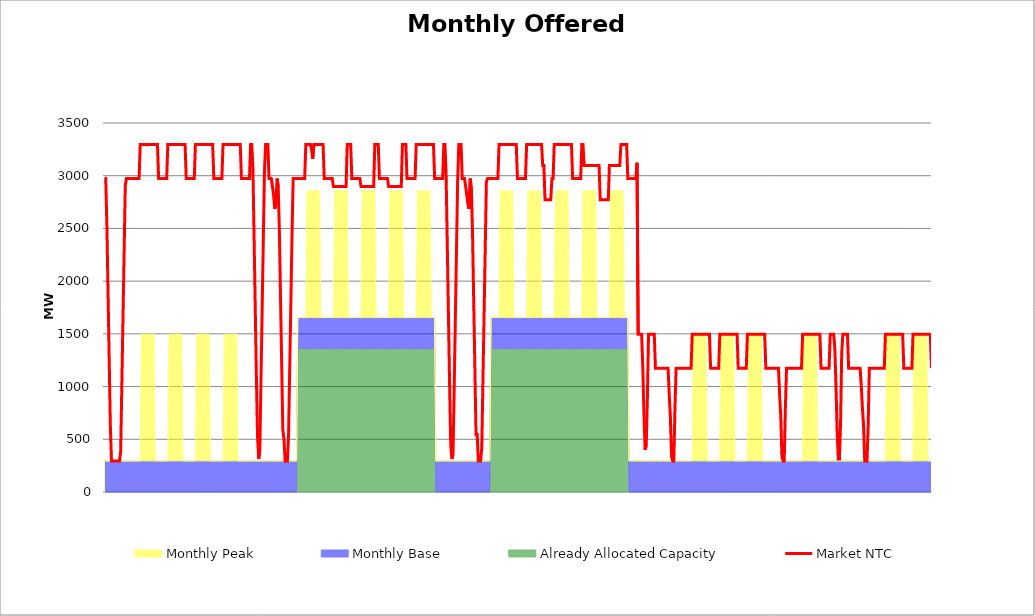
| Category | Market NTC |
|---|---|
| 0 | 2973 |
| 1 | 2973 |
| 2 | 2527 |
| 3 | 1897 |
| 4 | 1268 |
| 5 | 639 |
| 6 | 295 |
| 7 | 295 |
| 8 | 295 |
| 9 | 295 |
| 10 | 295 |
| 11 | 295 |
| 12 | 295 |
| 13 | 295 |
| 14 | 387 |
| 15 | 1016 |
| 16 | 1645 |
| 17 | 2275 |
| 18 | 2904 |
| 19 | 2973 |
| 20 | 2973 |
| 21 | 2973 |
| 22 | 2973 |
| 23 | 2973 |
| 24 | 2973 |
| 25 | 2973 |
| 26 | 2973 |
| 27 | 2973 |
| 28 | 2973 |
| 29 | 2973 |
| 30 | 2973 |
| 31 | 3297 |
| 32 | 3297 |
| 33 | 3297 |
| 34 | 3297 |
| 35 | 3297 |
| 36 | 3297 |
| 37 | 3292 |
| 38 | 3297 |
| 39 | 3297 |
| 40 | 3297 |
| 41 | 3297 |
| 42 | 3297 |
| 43 | 3297 |
| 44 | 3297 |
| 45 | 3297 |
| 46 | 3297 |
| 47 | 2973 |
| 48 | 2973 |
| 49 | 2973 |
| 50 | 2973 |
| 51 | 2973 |
| 52 | 2973 |
| 53 | 2973 |
| 54 | 2973 |
| 55 | 3297 |
| 56 | 3297 |
| 57 | 3297 |
| 58 | 3297 |
| 59 | 3297 |
| 60 | 3297 |
| 61 | 3297 |
| 62 | 3297 |
| 63 | 3297 |
| 64 | 3297 |
| 65 | 3297 |
| 66 | 3297 |
| 67 | 3297 |
| 68 | 3297 |
| 69 | 3297 |
| 70 | 3297 |
| 71 | 2973 |
| 72 | 2973 |
| 73 | 2973 |
| 74 | 2973 |
| 75 | 2973 |
| 76 | 2973 |
| 77 | 2973 |
| 78 | 2973 |
| 79 | 3297 |
| 80 | 3297 |
| 81 | 3297 |
| 82 | 3297 |
| 83 | 3297 |
| 84 | 3297 |
| 85 | 3297 |
| 86 | 3297 |
| 87 | 3297 |
| 88 | 3297 |
| 89 | 3297 |
| 90 | 3297 |
| 91 | 3297 |
| 92 | 3297 |
| 93 | 3297 |
| 94 | 3297 |
| 95 | 2973 |
| 96 | 2973 |
| 97 | 2973 |
| 98 | 2973 |
| 99 | 2973 |
| 100 | 2973 |
| 101 | 2973 |
| 102 | 2973 |
| 103 | 3297 |
| 104 | 3297 |
| 105 | 3297 |
| 106 | 3297 |
| 107 | 3297 |
| 108 | 3297 |
| 109 | 3297 |
| 110 | 3297 |
| 111 | 3297 |
| 112 | 3297 |
| 113 | 3297 |
| 114 | 3297 |
| 115 | 3297 |
| 116 | 3297 |
| 117 | 3297 |
| 118 | 3297 |
| 119 | 2973 |
| 120 | 2973 |
| 121 | 2973 |
| 122 | 2973 |
| 123 | 2973 |
| 124 | 2973 |
| 125 | 2973 |
| 126 | 2973 |
| 127 | 3297 |
| 128 | 3297 |
| 129 | 3073 |
| 130 | 2416 |
| 131 | 1759 |
| 132 | 1102 |
| 133 | 532 |
| 134 | 313 |
| 135 | 401 |
| 136 | 1058 |
| 137 | 1715 |
| 138 | 2372 |
| 139 | 3030 |
| 140 | 3297 |
| 141 | 3297 |
| 142 | 3297 |
| 143 | 2973 |
| 144 | 2973 |
| 145 | 2973 |
| 146 | 2896 |
| 147 | 2812 |
| 148 | 2686 |
| 149 | 2728 |
| 150 | 2973 |
| 151 | 2896 |
| 152 | 2476 |
| 153 | 1847 |
| 154 | 1218 |
| 155 | 588 |
| 156 | 504 |
| 157 | 295 |
| 158 | 295 |
| 159 | 295 |
| 160 | 546 |
| 161 | 1176 |
| 162 | 1805 |
| 163 | 2434 |
| 164 | 2973 |
| 165 | 2973 |
| 166 | 2973 |
| 167 | 2973 |
| 168 | 2973 |
| 169 | 2973 |
| 170 | 2973 |
| 171 | 2973 |
| 172 | 2973 |
| 173 | 2973 |
| 174 | 2973 |
| 175 | 3297 |
| 176 | 3297 |
| 177 | 3297 |
| 178 | 3297 |
| 179 | 3297 |
| 180 | 3249 |
| 181 | 3161 |
| 182 | 3297 |
| 183 | 3297 |
| 184 | 3297 |
| 185 | 3297 |
| 186 | 3297 |
| 187 | 3297 |
| 188 | 3297 |
| 189 | 3297 |
| 190 | 3297 |
| 191 | 2973 |
| 192 | 2973 |
| 193 | 2973 |
| 194 | 2973 |
| 195 | 2973 |
| 196 | 2973 |
| 197 | 2973 |
| 198 | 2973 |
| 199 | 2897 |
| 200 | 2897 |
| 201 | 2897 |
| 202 | 2897 |
| 203 | 2897 |
| 204 | 2897 |
| 205 | 2897 |
| 206 | 2897 |
| 207 | 2897 |
| 208 | 2897 |
| 209 | 2897 |
| 210 | 2897 |
| 211 | 3297 |
| 212 | 3297 |
| 213 | 3297 |
| 214 | 3297 |
| 215 | 2973 |
| 216 | 2973 |
| 217 | 2973 |
| 218 | 2973 |
| 219 | 2973 |
| 220 | 2973 |
| 221 | 2973 |
| 222 | 2973 |
| 223 | 2897 |
| 224 | 2897 |
| 225 | 2897 |
| 226 | 2897 |
| 227 | 2897 |
| 228 | 2897 |
| 229 | 2897 |
| 230 | 2897 |
| 231 | 2897 |
| 232 | 2897 |
| 233 | 2897 |
| 234 | 2897 |
| 235 | 3297 |
| 236 | 3297 |
| 237 | 3297 |
| 238 | 3297 |
| 239 | 2973 |
| 240 | 2973 |
| 241 | 2973 |
| 242 | 2973 |
| 243 | 2973 |
| 244 | 2973 |
| 245 | 2973 |
| 246 | 2973 |
| 247 | 2897 |
| 248 | 2897 |
| 249 | 2897 |
| 250 | 2897 |
| 251 | 2897 |
| 252 | 2897 |
| 253 | 2897 |
| 254 | 2897 |
| 255 | 2897 |
| 256 | 2897 |
| 257 | 2897 |
| 258 | 2897 |
| 259 | 3297 |
| 260 | 3297 |
| 261 | 3297 |
| 262 | 3297 |
| 263 | 2973 |
| 264 | 2973 |
| 265 | 2973 |
| 266 | 2973 |
| 267 | 2973 |
| 268 | 2973 |
| 269 | 2973 |
| 270 | 2973 |
| 271 | 3297 |
| 272 | 3297 |
| 273 | 3297 |
| 274 | 3297 |
| 275 | 3297 |
| 276 | 3297 |
| 277 | 3297 |
| 278 | 3297 |
| 279 | 3297 |
| 280 | 3297 |
| 281 | 3297 |
| 282 | 3297 |
| 283 | 3297 |
| 284 | 3297 |
| 285 | 3297 |
| 286 | 3297 |
| 287 | 2973 |
| 288 | 2973 |
| 289 | 2973 |
| 290 | 2973 |
| 291 | 2973 |
| 292 | 2973 |
| 293 | 2973 |
| 294 | 2973 |
| 295 | 3297 |
| 296 | 3297 |
| 297 | 3001 |
| 298 | 2344 |
| 299 | 1687 |
| 300 | 1030 |
| 301 | 445 |
| 302 | 313 |
| 303 | 357 |
| 304 | 970 |
| 305 | 1628 |
| 306 | 2285 |
| 307 | 2942 |
| 308 | 3297 |
| 309 | 3297 |
| 310 | 3297 |
| 311 | 2973 |
| 312 | 2973 |
| 313 | 2973 |
| 314 | 2896 |
| 315 | 2812 |
| 316 | 2728 |
| 317 | 2686 |
| 318 | 2973 |
| 319 | 2854 |
| 320 | 2434 |
| 321 | 1805 |
| 322 | 1176 |
| 323 | 546 |
| 324 | 546 |
| 325 | 295 |
| 326 | 295 |
| 327 | 295 |
| 328 | 420 |
| 329 | 1050 |
| 330 | 1679 |
| 331 | 2308 |
| 332 | 2938 |
| 333 | 2973 |
| 334 | 2973 |
| 335 | 2973 |
| 336 | 2973 |
| 337 | 2973 |
| 338 | 2973 |
| 339 | 2973 |
| 340 | 2973 |
| 341 | 2973 |
| 342 | 2973 |
| 343 | 3297 |
| 344 | 3297 |
| 345 | 3297 |
| 346 | 3297 |
| 347 | 3297 |
| 348 | 3297 |
| 349 | 3297 |
| 350 | 3297 |
| 351 | 3297 |
| 352 | 3297 |
| 353 | 3297 |
| 354 | 3297 |
| 355 | 3297 |
| 356 | 3297 |
| 357 | 3297 |
| 358 | 3297 |
| 359 | 2973 |
| 360 | 2973 |
| 361 | 2973 |
| 362 | 2973 |
| 363 | 2973 |
| 364 | 2973 |
| 365 | 2973 |
| 366 | 2973 |
| 367 | 3297 |
| 368 | 3297 |
| 369 | 3297 |
| 370 | 3297 |
| 371 | 3297 |
| 372 | 3297 |
| 373 | 3297 |
| 374 | 3297 |
| 375 | 3297 |
| 376 | 3297 |
| 377 | 3297 |
| 378 | 3297 |
| 379 | 3297 |
| 380 | 3297 |
| 381 | 3097 |
| 382 | 3097 |
| 383 | 2773 |
| 384 | 2773 |
| 385 | 2773 |
| 386 | 2773 |
| 387 | 2773 |
| 388 | 2773 |
| 389 | 2973 |
| 390 | 2973 |
| 391 | 3297 |
| 392 | 3297 |
| 393 | 3297 |
| 394 | 3297 |
| 395 | 3297 |
| 396 | 3297 |
| 397 | 3297 |
| 398 | 3297 |
| 399 | 3297 |
| 400 | 3297 |
| 401 | 3297 |
| 402 | 3297 |
| 403 | 3297 |
| 404 | 3297 |
| 405 | 3297 |
| 406 | 3297 |
| 407 | 2973 |
| 408 | 2973 |
| 409 | 2973 |
| 410 | 2973 |
| 411 | 2973 |
| 412 | 2973 |
| 413 | 2973 |
| 414 | 2973 |
| 415 | 3297 |
| 416 | 3297 |
| 417 | 3097 |
| 418 | 3097 |
| 419 | 3097 |
| 420 | 3097 |
| 421 | 3097 |
| 422 | 3097 |
| 423 | 3097 |
| 424 | 3097 |
| 425 | 3097 |
| 426 | 3097 |
| 427 | 3097 |
| 428 | 3097 |
| 429 | 3097 |
| 430 | 3097 |
| 431 | 2773 |
| 432 | 2773 |
| 433 | 2773 |
| 434 | 2773 |
| 435 | 2773 |
| 436 | 2773 |
| 437 | 2773 |
| 438 | 2773 |
| 439 | 3097 |
| 440 | 3097 |
| 441 | 3097 |
| 442 | 3097 |
| 443 | 3097 |
| 444 | 3097 |
| 445 | 3097 |
| 446 | 3097 |
| 447 | 3097 |
| 448 | 3097 |
| 449 | 3297 |
| 450 | 3297 |
| 451 | 3297 |
| 452 | 3297 |
| 453 | 3297 |
| 454 | 3297 |
| 455 | 2973 |
| 456 | 2973 |
| 457 | 2973 |
| 458 | 2973 |
| 459 | 2973 |
| 460 | 2973 |
| 461 | 2973 |
| 462 | 2973 |
| 463 | 3124 |
| 464 | 1497 |
| 465 | 1497 |
| 466 | 1497 |
| 467 | 1496 |
| 468 | 1189 |
| 469 | 751 |
| 470 | 401 |
| 471 | 445 |
| 472 | 883 |
| 473 | 1497 |
| 474 | 1497 |
| 475 | 1497 |
| 476 | 1497 |
| 477 | 1497 |
| 478 | 1497 |
| 479 | 1173 |
| 480 | 1173 |
| 481 | 1173 |
| 482 | 1173 |
| 483 | 1173 |
| 484 | 1173 |
| 485 | 1173 |
| 486 | 1173 |
| 487 | 1173 |
| 488 | 1173 |
| 489 | 1173 |
| 490 | 1173 |
| 491 | 924 |
| 492 | 714 |
| 493 | 336 |
| 494 | 295 |
| 495 | 295 |
| 496 | 798 |
| 497 | 1173 |
| 498 | 1173 |
| 499 | 1173 |
| 500 | 1173 |
| 501 | 1173 |
| 502 | 1173 |
| 503 | 1173 |
| 504 | 1173 |
| 505 | 1173 |
| 506 | 1173 |
| 507 | 1173 |
| 508 | 1173 |
| 509 | 1173 |
| 510 | 1173 |
| 511 | 1497 |
| 512 | 1497 |
| 513 | 1497 |
| 514 | 1497 |
| 515 | 1497 |
| 516 | 1497 |
| 517 | 1497 |
| 518 | 1497 |
| 519 | 1497 |
| 520 | 1497 |
| 521 | 1497 |
| 522 | 1497 |
| 523 | 1497 |
| 524 | 1497 |
| 525 | 1497 |
| 526 | 1497 |
| 527 | 1173 |
| 528 | 1173 |
| 529 | 1173 |
| 530 | 1173 |
| 531 | 1173 |
| 532 | 1173 |
| 533 | 1173 |
| 534 | 1173 |
| 535 | 1497 |
| 536 | 1497 |
| 537 | 1497 |
| 538 | 1497 |
| 539 | 1497 |
| 540 | 1497 |
| 541 | 1497 |
| 542 | 1497 |
| 543 | 1497 |
| 544 | 1497 |
| 545 | 1497 |
| 546 | 1497 |
| 547 | 1497 |
| 548 | 1497 |
| 549 | 1497 |
| 550 | 1497 |
| 551 | 1173 |
| 552 | 1173 |
| 553 | 1173 |
| 554 | 1173 |
| 555 | 1173 |
| 556 | 1173 |
| 557 | 1173 |
| 558 | 1173 |
| 559 | 1497 |
| 560 | 1497 |
| 561 | 1497 |
| 562 | 1497 |
| 563 | 1497 |
| 564 | 1497 |
| 565 | 1497 |
| 566 | 1497 |
| 567 | 1497 |
| 568 | 1497 |
| 569 | 1497 |
| 570 | 1497 |
| 571 | 1497 |
| 572 | 1497 |
| 573 | 1497 |
| 574 | 1497 |
| 575 | 1173 |
| 576 | 1173 |
| 577 | 1173 |
| 578 | 1173 |
| 579 | 1173 |
| 580 | 1173 |
| 581 | 1173 |
| 582 | 1173 |
| 583 | 1173 |
| 584 | 1173 |
| 585 | 1173 |
| 586 | 1173 |
| 587 | 924 |
| 588 | 714 |
| 589 | 336 |
| 590 | 295 |
| 591 | 295 |
| 592 | 798 |
| 593 | 1173 |
| 594 | 1173 |
| 595 | 1173 |
| 596 | 1173 |
| 597 | 1173 |
| 598 | 1173 |
| 599 | 1173 |
| 600 | 1173 |
| 601 | 1173 |
| 602 | 1173 |
| 603 | 1173 |
| 604 | 1173 |
| 605 | 1173 |
| 606 | 1173 |
| 607 | 1497 |
| 608 | 1497 |
| 609 | 1497 |
| 610 | 1497 |
| 611 | 1497 |
| 612 | 1497 |
| 613 | 1497 |
| 614 | 1497 |
| 615 | 1497 |
| 616 | 1497 |
| 617 | 1497 |
| 618 | 1497 |
| 619 | 1497 |
| 620 | 1497 |
| 621 | 1497 |
| 622 | 1497 |
| 623 | 1173 |
| 624 | 1173 |
| 625 | 1173 |
| 626 | 1173 |
| 627 | 1173 |
| 628 | 1173 |
| 629 | 1173 |
| 630 | 1173 |
| 631 | 1497 |
| 632 | 1497 |
| 633 | 1497 |
| 634 | 1497 |
| 635 | 1365 |
| 636 | 1014 |
| 637 | 576 |
| 638 | 313 |
| 639 | 313 |
| 640 | 664 |
| 641 | 1321 |
| 642 | 1497 |
| 643 | 1497 |
| 644 | 1497 |
| 645 | 1497 |
| 646 | 1497 |
| 647 | 1173 |
| 648 | 1173 |
| 649 | 1173 |
| 650 | 1173 |
| 651 | 1173 |
| 652 | 1173 |
| 653 | 1173 |
| 654 | 1173 |
| 655 | 1173 |
| 656 | 1173 |
| 657 | 1173 |
| 658 | 1008 |
| 659 | 798 |
| 660 | 630 |
| 661 | 295 |
| 662 | 295 |
| 663 | 295 |
| 664 | 630 |
| 665 | 1173 |
| 666 | 1173 |
| 667 | 1173 |
| 668 | 1173 |
| 669 | 1173 |
| 670 | 1173 |
| 671 | 1173 |
| 672 | 1173 |
| 673 | 1173 |
| 674 | 1173 |
| 675 | 1173 |
| 676 | 1173 |
| 677 | 1173 |
| 678 | 1173 |
| 679 | 1497 |
| 680 | 1497 |
| 681 | 1497 |
| 682 | 1497 |
| 683 | 1497 |
| 684 | 1497 |
| 685 | 1497 |
| 686 | 1497 |
| 687 | 1497 |
| 688 | 1497 |
| 689 | 1497 |
| 690 | 1497 |
| 691 | 1497 |
| 692 | 1497 |
| 693 | 1497 |
| 694 | 1497 |
| 695 | 1173 |
| 696 | 1173 |
| 697 | 1173 |
| 698 | 1173 |
| 699 | 1173 |
| 700 | 1173 |
| 701 | 1173 |
| 702 | 1173 |
| 703 | 1497 |
| 704 | 1497 |
| 705 | 1497 |
| 706 | 1497 |
| 707 | 1497 |
| 708 | 1497 |
| 709 | 1497 |
| 710 | 1497 |
| 711 | 1497 |
| 712 | 1497 |
| 713 | 1497 |
| 714 | 1497 |
| 715 | 1497 |
| 716 | 1497 |
| 717 | 1497 |
| 718 | 1497 |
| 719 | 1173 |